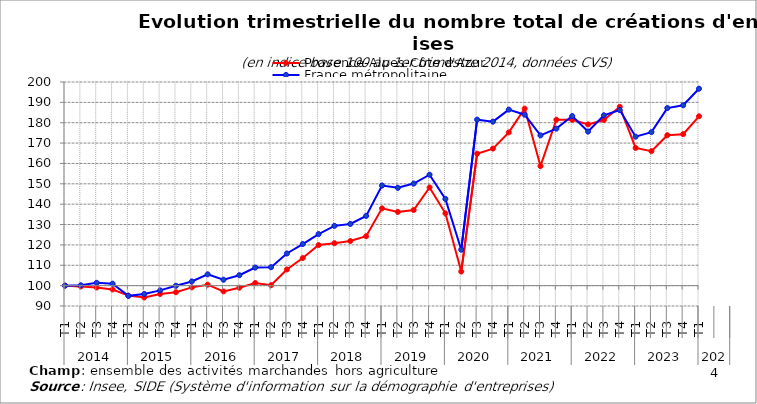
| Category | Provence-Alpes-Côte d'Azur | France métropolitaine |
|---|---|---|
| 0 | 100 | 100 |
| 1 | 99.59 | 100.192 |
| 2 | 99.087 | 101.371 |
| 3 | 98.121 | 100.95 |
| 4 | 95.124 | 94.985 |
| 5 | 94.178 | 95.892 |
| 6 | 95.911 | 97.67 |
| 7 | 96.778 | 99.933 |
| 8 | 99.146 | 102.063 |
| 9 | 100.47 | 105.554 |
| 10 | 97.188 | 102.913 |
| 11 | 98.994 | 105.117 |
| 12 | 101.277 | 108.866 |
| 13 | 100.212 | 109.052 |
| 14 | 107.953 | 115.781 |
| 15 | 113.537 | 120.419 |
| 16 | 119.922 | 125.326 |
| 17 | 120.835 | 129.353 |
| 18 | 121.894 | 130.304 |
| 19 | 124.262 | 134.236 |
| 20 | 137.958 | 149.159 |
| 21 | 136.198 | 148.045 |
| 22 | 137.151 | 150.122 |
| 23 | 148.214 | 154.474 |
| 24 | 135.504 | 142.591 |
| 25 | 106.927 | 117.653 |
| 26 | 164.801 | 181.506 |
| 27 | 167.295 | 180.52 |
| 28 | 175.255 | 186.432 |
| 29 | 186.946 | 183.95 |
| 30 | 158.72 | 173.788 |
| 31 | 181.494 | 177.089 |
| 32 | 181.408 | 183.277 |
| 33 | 179.172 | 175.663 |
| 34 | 181.322 | 183.639 |
| 35 | 187.806 | 186.227 |
| 36 | 167.633 | 173.152 |
| 37 | 166.051 | 175.389 |
| 38 | 173.865 | 187.19 |
| 39 | 174.388 | 188.575 |
| 40 | 183.161 | 196.708 |